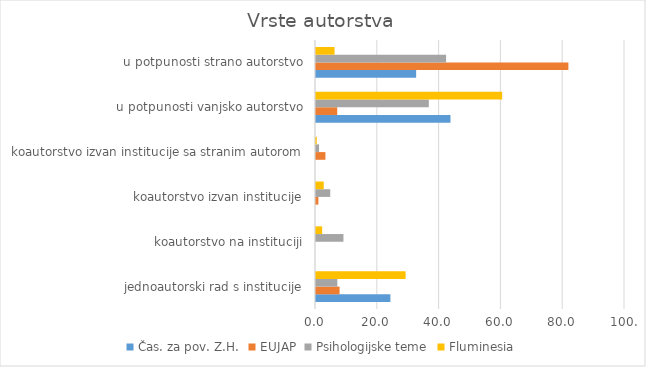
| Category | Čas. za pov. Z.H. | EUJAP | Psihologijske teme | Fluminesia |
|---|---|---|---|---|
| jednoautorski rad s institucije | 24.074 | 7.634 | 6.908 | 29 |
| koautorstvo na instituciji | 0 | 0 | 8.882 | 2 |
| koautorstvo izvan institucije | 0 | 0.763 | 4.605 | 2.5 |
| koautorstvo izvan institucije sa stranim autorom | 0 | 3.053 | 0.987 | 0.25 |
| u potpunosti vanjsko autorstvo | 43.519 | 6.87 | 36.513 | 60.25 |
| u potpunosti strano autorstvo | 32.407 | 81.679 | 42.105 | 6 |